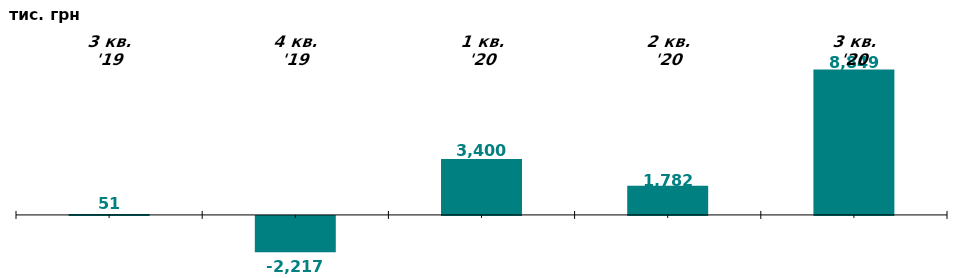
| Category | Чистий притік/відтік капіталу у 3-му кв. 2019-20 рр., тис. грн |
|---|---|
| 3 кв. '19 | 50.954 |
| 4 кв. '19 | -2216.998 |
| 1 кв. '20 | 3400.023 |
| 2 кв. '20 | 1781.633 |
| 3 кв. '20 | 8849.263 |